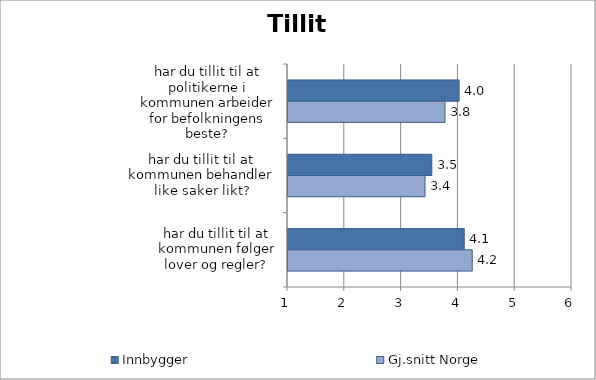
| Category | Innbygger | Gj.snitt Norge |
|---|---|---|
| har du tillit til at politikerne i kommunen arbeider for befolkningens beste? | 4.013 | 3.764 |
| har du tillit til at kommunen behandler like saker likt? | 3.532 | 3.412 |
| har du tillit til at kommunen følger lover og regler? | 4.103 | 4.243 |